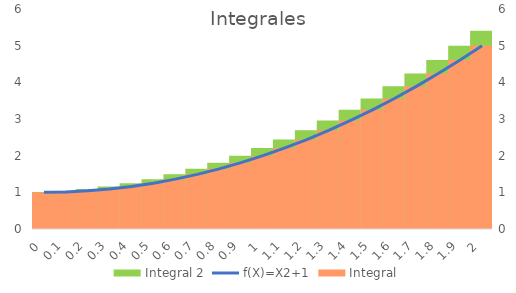
| Category | Integral 2 |
|---|---|
| 0.0 | 1.01 |
| 0.1 | 1.04 |
| 0.2 | 1.09 |
| 0.3 | 1.16 |
| 0.4 | 1.25 |
| 0.5 | 1.36 |
| 0.6 | 1.49 |
| 0.7 | 1.64 |
| 0.8 | 1.81 |
| 0.9 | 2 |
| 1.0 | 2.21 |
| 1.1 | 2.44 |
| 1.2 | 2.69 |
| 1.3 | 2.96 |
| 1.4 | 3.25 |
| 1.5 | 3.56 |
| 1.6 | 3.89 |
| 1.7 | 4.24 |
| 1.8 | 4.61 |
| 1.9 | 5 |
| 2.0 | 5.41 |